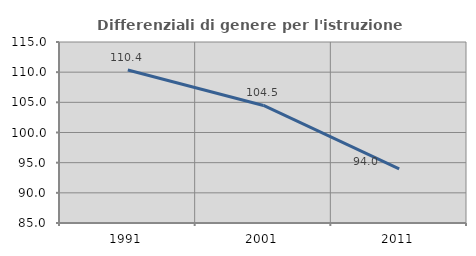
| Category | Differenziali di genere per l'istruzione superiore |
|---|---|
| 1991.0 | 110.361 |
| 2001.0 | 104.483 |
| 2011.0 | 93.983 |